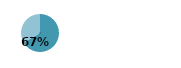
| Category | Series 0 |
|---|---|
| 0 | 0.665 |
| 1 | 0.335 |